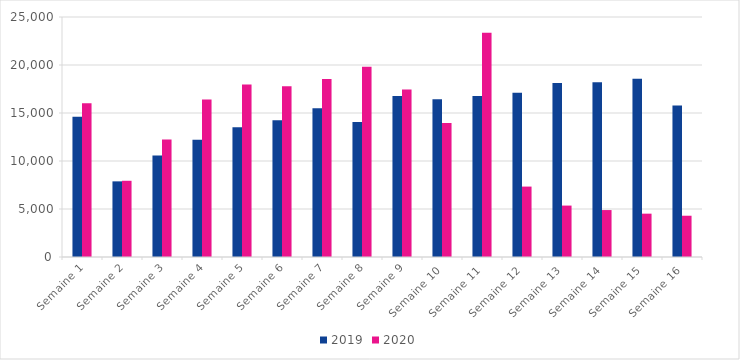
| Category | 2019 | 2020 |
|---|---|---|
| Semaine 1 | 14597 | 16013 |
| Semaine 2 | 7879 | 7939 |
| Semaine 3 | 10570 | 12246 |
| Semaine 4 | 12222 | 16406 |
| Semaine 5 | 13510 | 17979 |
| Semaine 6 | 14232 | 17775 |
| Semaine 7 | 15499 | 18536 |
| Semaine 8 | 14063 | 19809 |
| Semaine 9 | 16783 | 17453 |
| Semaine 10 | 16432 | 13956 |
| Semaine 11 | 16765 | 23350 |
| Semaine 12 | 17107 | 7335 |
| Semaine 13 | 18126 | 5356 |
| Semaine 14 | 18204 | 4890 |
| Semaine 15 | 18560 | 4514 |
| Semaine 16 | 15788 | 4299 |